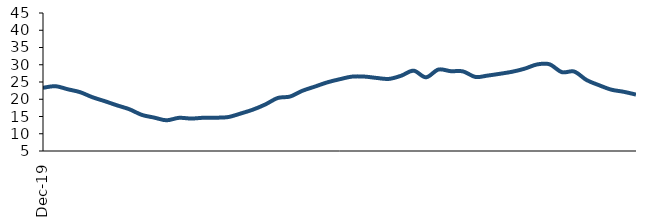
| Category | Series 0 |
|---|---|
| 2019-12-01 | 23.31 |
| 2020-01-01 | 23.785 |
| 2020-02-01 | 22.896 |
| 2020-03-01 | 22.054 |
| 2020-04-01 | 20.588 |
| 2020-05-01 | 19.441 |
| 2020-06-01 | 18.223 |
| 2020-07-01 | 17.09 |
| 2020-08-01 | 15.464 |
| 2020-09-01 | 14.683 |
| 2020-10-01 | 13.904 |
| 2020-11-01 | 14.612 |
| 2020-12-01 | 14.405 |
| 2021-01-01 | 14.638 |
| 2021-02-01 | 14.659 |
| 2021-03-01 | 14.838 |
| 2021-04-01 | 15.862 |
| 2021-05-01 | 16.999 |
| 2021-06-01 | 18.499 |
| 2021-07-01 | 20.368 |
| 2021-08-01 | 20.783 |
| 2021-09-01 | 22.46 |
| 2021-10-01 | 23.66 |
| 2021-11-01 | 24.883 |
| 2021-12-01 | 25.79 |
| 2022-01-01 | 26.554 |
| 2022-02-01 | 26.576 |
| 2022-03-01 | 26.178 |
| 2022-04-01 | 25.897 |
| 2022-05-01 | 26.829 |
| 2022-06-01 | 28.281 |
| 2022-07-01 | 26.359 |
| 2022-08-01 | 28.604 |
| 2022-09-01 | 28.14 |
| 2022-10-01 | 28.066 |
| 2022-11-01 | 26.461 |
| 2022-12-01 | 26.868 |
| 2023-01-01 | 27.389 |
| 2023-02-01 | 27.987 |
| 2023-03-01 | 28.877 |
| 2023-04-01 | 30.096 |
| 2023-05-01 | 30.136 |
| 2023-06-01 | 27.855 |
| 2023-07-01 | 28.026 |
| 2023-08-01 | 25.571 |
| 2023-09-01 | 24.08 |
| 2023-10-01 | 22.78 |
| 2023-11-01 | 22.165 |
| 2023-12-01 | 21.351 |